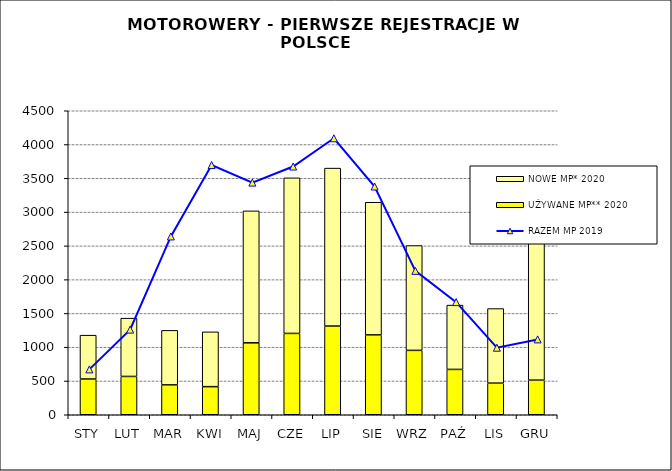
| Category | UŻYWANE MP** 2020 | NOWE MP* 2020 |
|---|---|---|
| STY | 529 | 649 |
| LUT | 567 | 863 |
| MAR | 442 | 807 |
| KWI | 416 | 811 |
| MAJ | 1065 | 1953 |
| CZE | 1204 | 2303 |
| LIP | 1313 | 2338 |
| SIE | 1182 | 1964 |
| WRZ | 953 | 1552 |
| PAŹ | 671 | 952 |
| LIS | 468 | 1104 |
| GRU | 512 | 3044 |